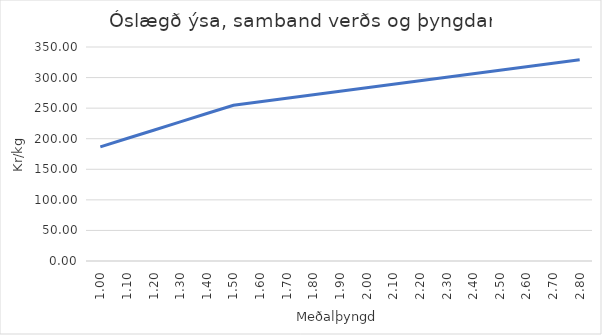
| Category | Series 0 |
|---|---|
| 1.0 | 186.658 |
| 1.1 | 200.289 |
| 1.2 | 213.92 |
| 1.3 | 227.551 |
| 1.4 | 241.182 |
| 1.5 | 254.812 |
| 1.6 | 260.522 |
| 1.7 | 266.231 |
| 1.8 | 271.941 |
| 1.9 | 277.651 |
| 2.0 | 283.36 |
| 2.1 | 289.07 |
| 2.2 | 294.779 |
| 2.3 | 300.489 |
| 2.4 | 306.198 |
| 2.5 | 311.908 |
| 2.6 | 317.617 |
| 2.7 | 323.327 |
| 2.8 | 329.037 |